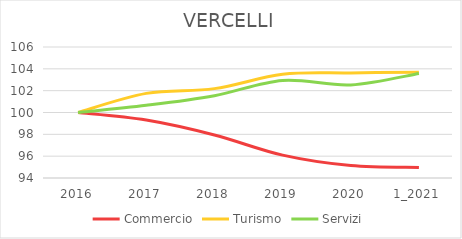
| Category | Commercio | Turismo | Servizi |
|---|---|---|---|
| 2016 | 100 | 100 | 100 |
| 2017 | 99.306 | 101.75 | 100.658 |
| 2018 | 97.938 | 102.188 | 101.543 |
| 2019 | 96.094 | 103.5 | 102.934 |
| 2020 | 95.143 | 103.625 | 102.529 |
| 1_2021 | 94.964 | 103.688 | 103.566 |